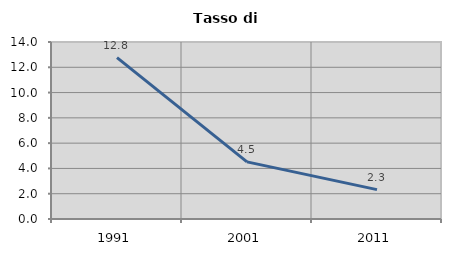
| Category | Tasso di disoccupazione   |
|---|---|
| 1991.0 | 12.762 |
| 2001.0 | 4.519 |
| 2011.0 | 2.322 |